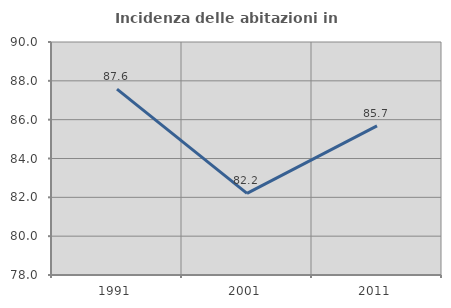
| Category | Incidenza delle abitazioni in proprietà  |
|---|---|
| 1991.0 | 87.572 |
| 2001.0 | 82.206 |
| 2011.0 | 85.679 |